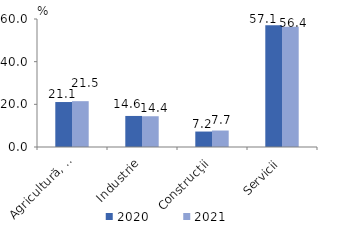
| Category | 2020 | 2021 |
|---|---|---|
| Agricultură, silvicultură şi pescuit | 21.08 | 21.481 |
| Industrie | 14.557 | 14.419 |
| Construcţii | 7.246 | 7.723 |
| Servicii | 57.117 | 56.376 |